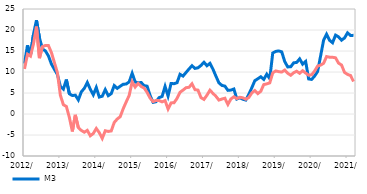
| Category | M3  | Домаћи кредити немонетарном сектору |
|---|---|---|
| 2012-01-01 | 12.01 | 10.729 |
| 2012-02-01 | 16.354 | 14.221 |
| 2012-03-01 | 13.992 | 13.782 |
| 2012-04-01 | 18.952 | 16.69 |
| 2012-05-01 | 22.329 | 20.823 |
| 2012-06-01 | 18.134 | 13.296 |
| 2012-07-01 | 15.507 | 16.043 |
| 2012-08-01 | 15.015 | 16.313 |
| 2012-09-01 | 13.837 | 16.292 |
| 2012-10-01 | 11.912 | 14.641 |
| 2012-11-01 | 10.629 | 12.241 |
| 2012-12-01 | 9.421 | 9.834 |
| 2013-01-01 | 6.554 | 4.448 |
| 2013-02-01 | 5.916 | 2.211 |
| 2013-03-01 | 8.196 | 1.791 |
| 2013-04-01 | 4.809 | -0.816 |
| 2013-05-01 | 4.39 | -4.149 |
| 2013-06-01 | 4.482 | -0.203 |
| 2013-07-01 | 3.358 | -3.232 |
| 2013-08-01 | 5.277 | -3.913 |
| 2013-09-01 | 6.108 | -4.338 |
| 2013-10-01 | 7.502 | -3.897 |
| 2013-11-01 | 5.896 | -5.181 |
| 2013-12-01 | 4.573 | -4.65 |
| 2014-01-01 | 6.313 | -3.453 |
| 2014-02-01 | 4.038 | -4.43 |
| 2014-03-01 | 4.234 | -5.804 |
| 2014-04-01 | 5.797 | -3.993 |
| 2014-05-01 | 4.358 | -4.149 |
| 2014-06-01 | 4.845 | -4.035 |
| 2014-07-01 | 6.767 | -2.016 |
| 2014-08-01 | 6.108 | -1.198 |
| 2014-09-01 | 6.605 | -0.64 |
| 2014-10-01 | 7.075 | 1.254 |
| 2014-11-01 | 7.143 | 2.875 |
| 2014-12-01 | 7.648 | 4.423 |
| 2015-01-01 | 9.694 | 7.684 |
| 2015-02-01 | 7.639 | 6.418 |
| 2015-03-01 | 7.404 | 7.278 |
| 2015-04-01 | 7.508 | 6.557 |
| 2015-05-01 | 6.749 | 6.196 |
| 2015-06-01 | 6.629 | 5.14 |
| 2015-07-01 | 4.381 | 3.777 |
| 2015-08-01 | 2.769 | 2.956 |
| 2015-09-01 | 2.936 | 3.226 |
| 2015-10-01 | 3.902 | 3.199 |
| 2015-11-01 | 4.175 | 2.893 |
| 2015-12-01 | 6.564 | 3.196 |
| 2016-01-01 | 4.278 | 1.199 |
| 2016-02-01 | 7.267 | 2.638 |
| 2016-03-01 | 7.218 | 2.687 |
| 2016-04-01 | 7.458 | 3.711 |
| 2016-05-01 | 9.45 | 5.171 |
| 2016-06-01 | 9.03 | 5.69 |
| 2016-07-01 | 9.881 | 6.257 |
| 2016-08-01 | 10.715 | 6.355 |
| 2016-09-01 | 11.496 | 7.196 |
| 2016-10-01 | 10.853 | 5.785 |
| 2016-11-01 | 11.002 | 5.691 |
| 2016-12-01 | 11.553 | 3.906 |
| 2017-01-01 | 12.319 | 3.475 |
| 2017-02-01 | 11.489 | 4.47 |
| 2017-03-01 | 12.067 | 5.654 |
| 2017-04-01 | 10.696 | 4.923 |
| 2017-05-01 | 9.013 | 4.221 |
| 2017-06-01 | 7.423 | 3.312 |
| 2017-07-01 | 6.807 | 3.565 |
| 2017-08-01 | 6.642 | 3.755 |
| 2017-09-01 | 5.632 | 2.278 |
| 2017-10-01 | 5.691 | 3.574 |
| 2017-11-01 | 5.952 | 4.092 |
| 2017-12-01 | 3.567 | 3.671 |
| 2018-01-01 | 3.888 | 3.977 |
| 2018-02-01 | 3.511 | 3.859 |
| 2018-03-01 | 3.318 | 3.502 |
| 2018-04-01 | 4.689 | 3.934 |
| 2018-05-01 | 6.249 | 5.016 |
| 2018-06-01 | 7.929 | 5.586 |
| 2018-07-01 | 8.383 | 4.847 |
| 2018-08-01 | 8.861 | 5.412 |
| 2018-09-01 | 8.24 | 7.016 |
| 2018-10-31 | 9.483 | 7.163 |
| 2018-11-30 | 8.409 | 7.417 |
| 2018-12-31 | 14.522 | 9.795 |
| 2019-01-31 | 14.909 | 10.252 |
| 2019-02-28 | 15.018 | 10.086 |
| 2019-03-31 | 14.797 | 9.982 |
| 2019-04-30 | 12.506 | 10.464 |
| 2019-05-31 | 11.216 | 9.694 |
| 2019-06-30 | 11.23 | 9.224 |
| 2019-07-31 | 12.186 | 9.826 |
| 2019-08-31 | 12.279 | 10.177 |
| 2019-09-30 | 13.127 | 9.697 |
| 2019-10-31 | 11.864 | 10.311 |
| 2019-11-30 | 12.513 | 9.755 |
| 2019-12-31 | 8.354 | 9.245 |
| 2020-01-31 | 8.237 | 9.334 |
| 2020-02-29 | 9.035 | 10.229 |
| 2020-03-31 | 10.113 | 11.424 |
| 2020-04-30 | 13.811 | 11.641 |
| 2020-05-31 | 17.557 | 12.071 |
| 2020-06-30 | 18.995 | 13.679 |
| 2020-07-31 | 17.552 | 13.526 |
| 2020-08-31 | 16.965 | 13.505 |
| 2020-09-30 | 18.779 | 13.379 |
| 2020-10-31 | 18.356 | 12.108 |
| 2020-11-30 | 17.578 | 11.663 |
| 2020-12-31 | 18.105 | 9.901 |
| 2021-01-31 | 19.323 | 9.428 |
| 2021-02-28 | 18.702 | 9.17 |
| 2021-03-31 | 18.724 | 7.735 |